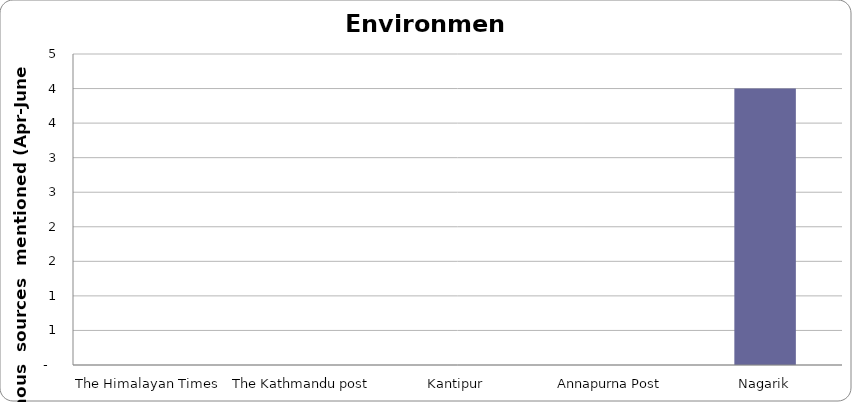
| Category | Environment |
|---|---|
| The Himalayan Times | 0 |
| The Kathmandu post | 0 |
| Kantipur | 0 |
| Annapurna Post | 0 |
| Nagarik | 4 |